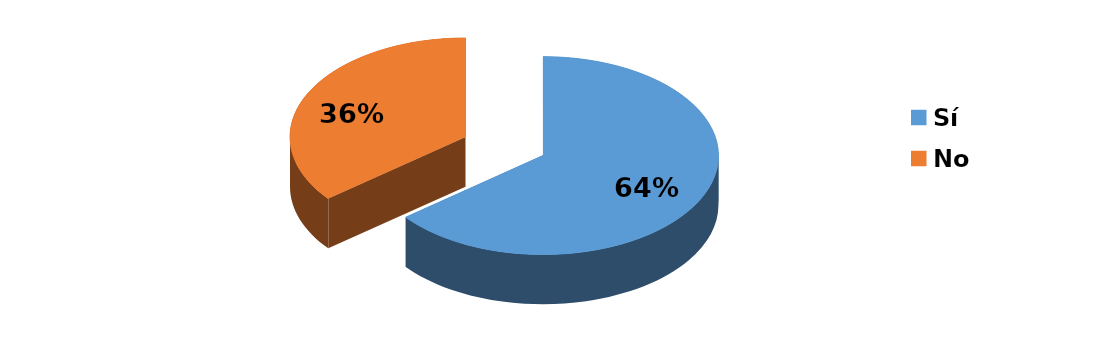
| Category | Series 0 |
|---|---|
| Sí | 153 |
| No | 85 |